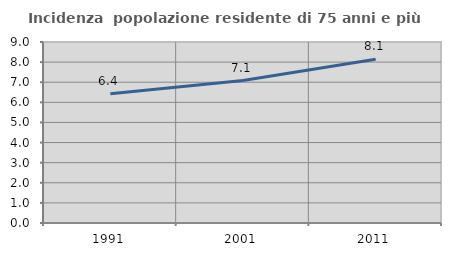
| Category | Incidenza  popolazione residente di 75 anni e più |
|---|---|
| 1991.0 | 6.429 |
| 2001.0 | 7.084 |
| 2011.0 | 8.144 |